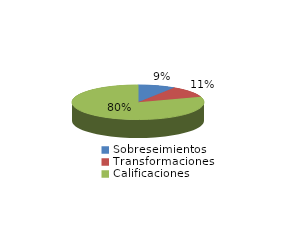
| Category | Series 0 |
|---|---|
| Sobreseimientos | 95 |
| Transformaciones | 111 |
| Calificaciones | 830 |